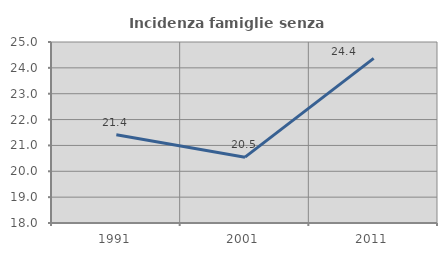
| Category | Incidenza famiglie senza nuclei |
|---|---|
| 1991.0 | 21.413 |
| 2001.0 | 20.546 |
| 2011.0 | 24.369 |